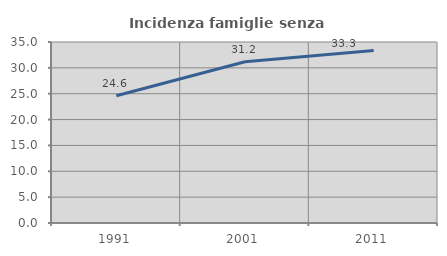
| Category | Incidenza famiglie senza nuclei |
|---|---|
| 1991.0 | 24.607 |
| 2001.0 | 31.183 |
| 2011.0 | 33.333 |